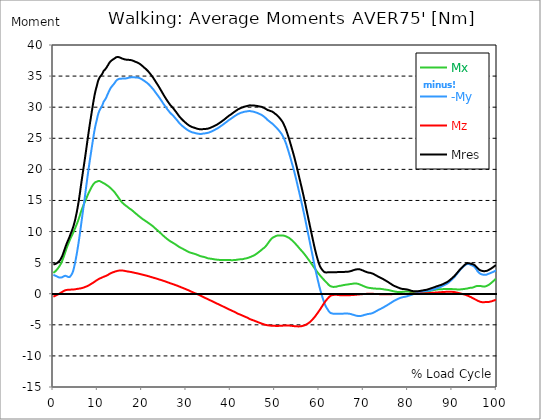
| Category |  Mx |  -My |  Mz |  Mres |
|---|---|---|---|---|
| 0.0 | 3.353 | 3.054 | -0.48 | 4.722 |
| 0.1646090534979424 | 3.444 | 2.991 | -0.417 | 4.74 |
| 0.3292181069958848 | 3.535 | 2.927 | -0.353 | 4.758 |
| 0.5041152263374485 | 3.643 | 2.891 | -0.299 | 4.803 |
| 0.668724279835391 | 3.77 | 2.837 | -0.245 | 4.867 |
| 0.8333333333333333 | 3.906 | 2.764 | -0.181 | 4.93 |
| 0.9979423868312757 | 4.051 | 2.701 | -0.118 | 5.012 |
| 1.162551440329218 | 4.223 | 2.637 | -0.054 | 5.112 |
| 1.337448559670782 | 4.396 | 2.601 | 0.009 | 5.238 |
| 1.5020576131687242 | 4.568 | 2.583 | 0.073 | 5.374 |
| 1.6666666666666665 | 4.785 | 2.592 | 0.154 | 5.574 |
| 1.831275720164609 | 5.03 | 2.637 | 0.227 | 5.809 |
| 1.9958847736625513 | 5.293 | 2.655 | 0.29 | 6.063 |
| 2.170781893004115 | 5.61 | 2.728 | 0.372 | 6.38 |
| 2.3353909465020575 | 5.936 | 2.8 | 0.435 | 6.716 |
| 2.4999999999999996 | 6.281 | 2.864 | 0.498 | 7.06 |
| 2.6646090534979425 | 6.634 | 2.891 | 0.553 | 7.405 |
| 2.829218106995885 | 6.988 | 2.882 | 0.589 | 7.74 |
| 3.0041152263374484 | 7.341 | 2.819 | 0.607 | 8.057 |
| 3.168724279835391 | 7.667 | 2.746 | 0.616 | 8.338 |
| 3.333333333333333 | 7.966 | 2.692 | 0.634 | 8.61 |
| 3.497942386831276 | 8.266 | 2.655 | 0.643 | 8.891 |
| 3.662551440329218 | 8.565 | 2.683 | 0.653 | 9.181 |
| 3.837448559670782 | 8.846 | 2.8 | 0.662 | 9.498 |
| 4.002057613168724 | 9.108 | 2.964 | 0.662 | 9.815 |
| 4.166666666666667 | 9.362 | 3.163 | 0.671 | 10.123 |
| 4.3312757201646095 | 9.607 | 3.408 | 0.671 | 10.441 |
| 4.495884773662552 | 9.852 | 3.734 | 0.671 | 10.785 |
| 4.670781893004115 | 10.132 | 4.242 | 0.689 | 11.22 |
| 4.835390946502058 | 10.404 | 4.749 | 0.707 | 11.646 |
| 4.999999999999999 | 10.694 | 5.347 | 0.725 | 12.163 |
| 5.164609053497943 | 10.993 | 5.973 | 0.743 | 12.725 |
| 5.329218106995885 | 11.284 | 6.625 | 0.77 | 13.314 |
| 5.504115226337448 | 11.601 | 7.359 | 0.788 | 13.975 |
| 5.668724279835391 | 11.918 | 8.111 | 0.807 | 14.673 |
| 5.833333333333333 | 12.28 | 8.909 | 0.825 | 15.434 |
| 5.997942386831276 | 12.643 | 9.725 | 0.843 | 16.232 |
| 6.162551440329218 | 13.033 | 10.631 | 0.861 | 17.12 |
| 6.337448559670782 | 13.377 | 11.51 | 0.888 | 17.945 |
| 6.502057613168724 | 13.703 | 12.38 | 0.915 | 18.761 |
| 6.666666666666666 | 14.011 | 13.25 | 0.952 | 19.576 |
| 6.831275720164609 | 14.311 | 14.12 | 0.997 | 20.365 |
| 6.995884773662552 | 14.592 | 14.981 | 1.033 | 21.162 |
| 7.170781893004115 | 14.872 | 15.906 | 1.088 | 21.978 |
| 7.3353909465020575 | 15.144 | 16.83 | 1.133 | 22.803 |
| 7.500000000000001 | 15.434 | 17.727 | 1.187 | 23.664 |
| 7.664609053497942 | 15.724 | 18.625 | 1.233 | 24.525 |
| 7.829218106995885 | 16.005 | 19.486 | 1.287 | 25.367 |
| 8.004115226337449 | 16.259 | 20.347 | 1.35 | 26.192 |
| 8.168724279835391 | 16.513 | 21.18 | 1.414 | 26.999 |
| 8.333333333333334 | 16.749 | 21.96 | 1.495 | 27.76 |
| 8.497942386831278 | 16.984 | 22.739 | 1.568 | 28.512 |
| 8.662551440329219 | 17.202 | 23.519 | 1.64 | 29.274 |
| 8.837448559670783 | 17.401 | 24.289 | 1.713 | 30.008 |
| 9.002057613168725 | 17.573 | 25.068 | 1.785 | 30.742 |
| 9.166666666666668 | 17.736 | 25.812 | 1.867 | 31.44 |
| 9.33127572016461 | 17.854 | 26.473 | 1.949 | 32.065 |
| 9.495884773662551 | 17.954 | 27.071 | 2.039 | 32.618 |
| 9.670781893004117 | 17.999 | 27.579 | 2.112 | 33.071 |
| 9.83539094650206 | 18.035 | 28.05 | 2.193 | 33.497 |
| 9.999999999999998 | 18.108 | 28.621 | 2.266 | 34.014 |
| 10.16460905349794 | 18.135 | 29.02 | 2.338 | 34.376 |
| 10.329218106995887 | 18.135 | 29.337 | 2.402 | 34.648 |
| 10.504115226337447 | 18.108 | 29.618 | 2.456 | 34.875 |
| 10.66872427983539 | 18.045 | 29.817 | 2.51 | 35.029 |
| 10.833333333333334 | 17.972 | 30.008 | 2.556 | 35.165 |
| 10.997942386831275 | 17.9 | 30.234 | 2.61 | 35.328 |
| 11.162551440329217 | 17.845 | 30.524 | 2.665 | 35.554 |
| 11.337448559670783 | 17.809 | 30.869 | 2.728 | 35.835 |
| 11.502057613168724 | 17.718 | 31.05 | 2.773 | 35.962 |
| 11.666666666666666 | 17.628 | 31.213 | 2.81 | 36.053 |
| 11.831275720164609 | 17.564 | 31.413 | 2.855 | 36.198 |
| 11.995884773662551 | 17.492 | 31.666 | 2.909 | 36.379 |
| 12.170781893004115 | 17.41 | 31.956 | 2.982 | 36.597 |
| 12.335390946502057 | 17.319 | 32.201 | 3.036 | 36.769 |
| 12.5 | 17.238 | 32.5 | 3.118 | 36.995 |
| 12.664609053497943 | 17.129 | 32.745 | 3.19 | 37.159 |
| 12.829218106995885 | 17.029 | 32.971 | 3.263 | 37.322 |
| 13.004115226337449 | 16.903 | 33.162 | 3.317 | 37.439 |
| 13.168724279835391 | 16.803 | 33.316 | 3.371 | 37.53 |
| 13.333333333333332 | 16.694 | 33.461 | 3.417 | 37.612 |
| 13.497942386831276 | 16.576 | 33.597 | 3.453 | 37.693 |
| 13.662551440329217 | 16.449 | 33.742 | 3.498 | 37.766 |
| 13.837448559670783 | 16.304 | 33.905 | 3.535 | 37.856 |
| 14.002057613168724 | 16.141 | 34.086 | 3.58 | 37.947 |
| 14.166666666666666 | 15.987 | 34.249 | 3.616 | 38.029 |
| 14.33127572016461 | 15.815 | 34.358 | 3.652 | 38.065 |
| 14.495884773662551 | 15.652 | 34.449 | 3.689 | 38.074 |
| 14.670781893004115 | 15.48 | 34.521 | 3.707 | 38.074 |
| 14.835390946502057 | 15.317 | 34.548 | 3.725 | 38.038 |
| 15.000000000000002 | 15.144 | 34.566 | 3.743 | 37.983 |
| 15.164609053497943 | 14.963 | 34.585 | 3.752 | 37.938 |
| 15.329218106995883 | 14.818 | 34.585 | 3.752 | 37.874 |
| 15.504115226337449 | 14.682 | 34.594 | 3.743 | 37.829 |
| 15.66872427983539 | 14.564 | 34.594 | 3.725 | 37.784 |
| 15.833333333333334 | 14.465 | 34.603 | 3.707 | 37.748 |
| 15.997942386831276 | 14.356 | 34.612 | 3.689 | 37.72 |
| 16.162551440329217 | 14.256 | 34.612 | 3.661 | 37.675 |
| 16.337448559670783 | 14.175 | 34.621 | 3.634 | 37.657 |
| 16.502057613168724 | 14.084 | 34.639 | 3.616 | 37.639 |
| 16.666666666666668 | 13.993 | 34.666 | 3.589 | 37.63 |
| 16.83127572016461 | 13.903 | 34.702 | 3.571 | 37.621 |
| 16.995884773662556 | 13.803 | 34.739 | 3.553 | 37.612 |
| 17.170781893004115 | 13.703 | 34.766 | 3.535 | 37.603 |
| 17.33539094650206 | 13.631 | 34.784 | 3.516 | 37.584 |
| 17.500000000000004 | 13.558 | 34.802 | 3.489 | 37.566 |
| 17.66460905349794 | 13.468 | 34.82 | 3.471 | 37.548 |
| 17.82921810699589 | 13.368 | 34.829 | 3.444 | 37.512 |
| 18.00411522633745 | 13.268 | 34.82 | 3.417 | 37.467 |
| 18.16872427983539 | 13.16 | 34.811 | 3.39 | 37.412 |
| 18.333333333333336 | 13.06 | 34.793 | 3.362 | 37.358 |
| 18.497942386831276 | 12.951 | 34.784 | 3.335 | 37.304 |
| 18.66255144032922 | 12.851 | 34.784 | 3.317 | 37.258 |
| 18.837448559670786 | 12.761 | 34.775 | 3.29 | 37.222 |
| 19.002057613168724 | 12.661 | 34.766 | 3.263 | 37.177 |
| 19.166666666666668 | 12.552 | 34.739 | 3.236 | 37.104 |
| 19.331275720164612 | 12.462 | 34.702 | 3.208 | 37.032 |
| 19.495884773662553 | 12.371 | 34.657 | 3.181 | 36.959 |
| 19.67078189300412 | 12.271 | 34.603 | 3.145 | 36.869 |
| 19.83539094650206 | 12.172 | 34.539 | 3.118 | 36.778 |
| 19.999999999999996 | 12.081 | 34.467 | 3.091 | 36.678 |
| 20.164609053497944 | 11.999 | 34.394 | 3.054 | 36.578 |
| 20.32921810699588 | 11.909 | 34.322 | 3.027 | 36.479 |
| 20.504115226337447 | 11.836 | 34.231 | 2.991 | 36.361 |
| 20.66872427983539 | 11.755 | 34.15 | 2.964 | 36.261 |
| 20.833333333333332 | 11.682 | 34.068 | 2.936 | 36.162 |
| 20.997942386831276 | 11.601 | 33.996 | 2.909 | 36.062 |
| 21.162551440329217 | 11.519 | 33.896 | 2.873 | 35.935 |
| 21.33744855967078 | 11.438 | 33.796 | 2.837 | 35.808 |
| 21.502057613168724 | 11.347 | 33.687 | 2.81 | 35.681 |
| 21.666666666666668 | 11.265 | 33.57 | 2.773 | 35.536 |
| 21.83127572016461 | 11.184 | 33.434 | 2.737 | 35.382 |
| 21.99588477366255 | 11.102 | 33.298 | 2.701 | 35.228 |
| 22.170781893004115 | 11.012 | 33.171 | 2.665 | 35.074 |
| 22.335390946502056 | 10.921 | 33.035 | 2.628 | 34.911 |
| 22.5 | 10.821 | 32.899 | 2.592 | 34.748 |
| 22.664609053497944 | 10.713 | 32.745 | 2.556 | 34.566 |
| 22.82921810699588 | 10.604 | 32.591 | 2.529 | 34.385 |
| 23.004115226337447 | 10.495 | 32.419 | 2.492 | 34.195 |
| 23.16872427983539 | 10.386 | 32.264 | 2.456 | 34.005 |
| 23.333333333333332 | 10.278 | 32.101 | 2.42 | 33.814 |
| 23.497942386831276 | 10.187 | 31.947 | 2.375 | 33.642 |
| 23.662551440329217 | 10.078 | 31.784 | 2.338 | 33.443 |
| 23.83744855967078 | 9.969 | 31.612 | 2.302 | 33.252 |
| 24.002057613168727 | 9.861 | 31.44 | 2.266 | 33.044 |
| 24.166666666666664 | 9.752 | 31.258 | 2.23 | 32.845 |
| 24.33127572016461 | 9.634 | 31.086 | 2.193 | 32.636 |
| 24.495884773662553 | 9.525 | 30.905 | 2.157 | 32.437 |
| 24.670781893004115 | 9.417 | 30.724 | 2.112 | 32.228 |
| 24.83539094650206 | 9.308 | 30.542 | 2.075 | 32.02 |
| 25.0 | 9.199 | 30.37 | 2.039 | 31.82 |
| 25.164609053497944 | 9.099 | 30.207 | 1.994 | 31.63 |
| 25.329218106995885 | 9 | 30.035 | 1.958 | 31.44 |
| 25.504115226337447 | 8.9 | 29.872 | 1.912 | 31.249 |
| 25.66872427983539 | 8.8 | 29.709 | 1.867 | 31.068 |
| 25.833333333333332 | 8.71 | 29.555 | 1.822 | 30.896 |
| 25.997942386831276 | 8.619 | 29.41 | 1.785 | 30.724 |
| 26.16255144032922 | 8.537 | 29.256 | 1.74 | 30.552 |
| 26.337448559670783 | 8.456 | 29.111 | 1.695 | 30.388 |
| 26.502057613168724 | 8.383 | 28.993 | 1.659 | 30.252 |
| 26.666666666666664 | 8.311 | 28.875 | 1.613 | 30.117 |
| 26.83127572016461 | 8.247 | 28.757 | 1.577 | 29.99 |
| 26.995884773662553 | 8.175 | 28.648 | 1.532 | 29.863 |
| 27.170781893004115 | 8.102 | 28.512 | 1.486 | 29.709 |
| 27.33539094650206 | 8.03 | 28.376 | 1.45 | 29.555 |
| 27.499999999999996 | 7.957 | 28.25 | 1.405 | 29.41 |
| 27.66460905349794 | 7.876 | 28.105 | 1.359 | 29.246 |
| 27.829218106995885 | 7.794 | 27.96 | 1.323 | 29.083 |
| 28.004115226337447 | 7.713 | 27.815 | 1.278 | 28.92 |
| 28.16872427983539 | 7.631 | 27.66 | 1.224 | 28.748 |
| 28.333333333333332 | 7.55 | 27.515 | 1.178 | 28.585 |
| 28.49794238683128 | 7.477 | 27.389 | 1.133 | 28.44 |
| 28.66255144032922 | 7.414 | 27.262 | 1.088 | 28.304 |
| 28.837448559670783 | 7.35 | 27.144 | 1.033 | 28.177 |
| 29.002057613168724 | 7.287 | 27.035 | 0.988 | 28.05 |
| 29.166666666666664 | 7.232 | 26.926 | 0.943 | 27.932 |
| 29.331275720164612 | 7.169 | 26.836 | 0.888 | 27.815 |
| 29.495884773662553 | 7.105 | 26.736 | 0.843 | 27.706 |
| 29.670781893004115 | 7.042 | 26.645 | 0.798 | 27.597 |
| 29.835390946502056 | 6.979 | 26.555 | 0.752 | 27.497 |
| 30.000000000000004 | 6.915 | 26.464 | 0.698 | 27.398 |
| 30.164609053497944 | 6.843 | 26.383 | 0.653 | 27.298 |
| 30.329218106995885 | 6.779 | 26.301 | 0.598 | 27.198 |
| 30.504115226337447 | 6.716 | 26.228 | 0.553 | 27.108 |
| 30.66872427983539 | 6.67 | 26.165 | 0.498 | 27.035 |
| 30.833333333333336 | 6.625 | 26.102 | 0.435 | 26.972 |
| 30.99794238683128 | 6.589 | 26.047 | 0.381 | 26.908 |
| 31.162551440329217 | 6.553 | 26.002 | 0.326 | 26.854 |
| 31.33744855967078 | 6.516 | 25.957 | 0.272 | 26.799 |
| 31.50205761316873 | 6.489 | 25.929 | 0.218 | 26.763 |
| 31.666666666666668 | 6.453 | 25.902 | 0.163 | 26.727 |
| 31.831275720164612 | 6.417 | 25.875 | 0.118 | 26.691 |
| 31.995884773662553 | 6.38 | 25.839 | 0.063 | 26.645 |
| 32.17078189300411 | 6.335 | 25.812 | 0.018 | 26.609 |
| 32.33539094650206 | 6.29 | 25.775 | -0.018 | 26.564 |
| 32.5 | 6.244 | 25.748 | -0.073 | 26.528 |
| 32.66460905349794 | 6.19 | 25.73 | -0.127 | 26.5 |
| 32.82921810699589 | 6.145 | 25.712 | -0.181 | 26.473 |
| 33.00411522633745 | 6.09 | 25.703 | -0.236 | 26.455 |
| 33.168724279835395 | 6.045 | 25.694 | -0.299 | 26.428 |
| 33.333333333333336 | 6.018 | 25.685 | -0.363 | 26.428 |
| 33.49794238683128 | 5.982 | 25.703 | -0.417 | 26.437 |
| 33.66255144032922 | 5.963 | 25.739 | -0.48 | 26.464 |
| 33.83744855967078 | 5.936 | 25.766 | -0.535 | 26.482 |
| 34.00205761316873 | 5.9 | 25.775 | -0.589 | 26.491 |
| 34.16666666666667 | 5.873 | 25.784 | -0.653 | 26.491 |
| 34.331275720164605 | 5.828 | 25.793 | -0.707 | 26.5 |
| 34.49588477366255 | 5.791 | 25.812 | -0.761 | 26.5 |
| 34.67078189300412 | 5.737 | 25.848 | -0.816 | 26.528 |
| 34.83539094650206 | 5.701 | 25.875 | -0.861 | 26.555 |
| 35.00000000000001 | 5.673 | 25.902 | -0.924 | 26.573 |
| 35.16460905349794 | 5.655 | 25.948 | -0.979 | 26.618 |
| 35.32921810699588 | 5.646 | 25.993 | -1.042 | 26.664 |
| 35.504115226337454 | 5.637 | 26.047 | -1.097 | 26.709 |
| 35.668724279835395 | 5.61 | 26.093 | -1.151 | 26.763 |
| 35.833333333333336 | 5.592 | 26.147 | -1.205 | 26.809 |
| 35.99794238683128 | 5.574 | 26.21 | -1.269 | 26.872 |
| 36.16255144032922 | 5.556 | 26.274 | -1.332 | 26.926 |
| 36.33744855967078 | 5.538 | 26.328 | -1.387 | 26.981 |
| 36.50205761316873 | 5.51 | 26.392 | -1.441 | 27.044 |
| 36.66666666666667 | 5.492 | 26.455 | -1.495 | 27.108 |
| 36.831275720164605 | 5.483 | 26.518 | -1.55 | 27.171 |
| 36.99588477366255 | 5.465 | 26.582 | -1.613 | 27.234 |
| 37.17078189300412 | 5.456 | 26.664 | -1.668 | 27.307 |
| 37.33539094650206 | 5.447 | 26.736 | -1.722 | 27.389 |
| 37.5 | 5.438 | 26.818 | -1.785 | 27.47 |
| 37.66460905349794 | 5.42 | 26.899 | -1.84 | 27.552 |
| 37.82921810699589 | 5.411 | 26.99 | -1.894 | 27.642 |
| 38.00411522633745 | 5.402 | 27.071 | -1.949 | 27.724 |
| 38.168724279835395 | 5.411 | 27.153 | -2.012 | 27.805 |
| 38.333333333333336 | 5.411 | 27.234 | -2.066 | 27.896 |
| 38.49794238683127 | 5.411 | 27.325 | -2.121 | 27.987 |
| 38.662551440329224 | 5.411 | 27.416 | -2.175 | 28.077 |
| 38.83744855967078 | 5.411 | 27.506 | -2.239 | 28.177 |
| 39.00205761316872 | 5.411 | 27.597 | -2.293 | 28.277 |
| 39.16666666666667 | 5.42 | 27.688 | -2.347 | 28.367 |
| 39.331275720164605 | 5.42 | 27.778 | -2.411 | 28.467 |
| 39.49588477366255 | 5.42 | 27.869 | -2.474 | 28.558 |
| 39.67078189300412 | 5.42 | 27.96 | -2.529 | 28.657 |
| 39.83539094650206 | 5.42 | 28.041 | -2.592 | 28.739 |
| 39.99999999999999 | 5.402 | 28.114 | -2.637 | 28.811 |
| 40.16460905349794 | 5.393 | 28.195 | -2.692 | 28.884 |
| 40.32921810699589 | 5.393 | 28.277 | -2.746 | 28.975 |
| 40.50411522633745 | 5.402 | 28.367 | -2.8 | 29.065 |
| 40.668724279835395 | 5.402 | 28.458 | -2.855 | 29.165 |
| 40.83333333333333 | 5.411 | 28.54 | -2.918 | 29.256 |
| 40.99794238683128 | 5.429 | 28.612 | -2.973 | 29.328 |
| 41.16255144032922 | 5.438 | 28.685 | -3.036 | 29.41 |
| 41.33744855967078 | 5.456 | 28.757 | -3.1 | 29.491 |
| 41.50205761316872 | 5.474 | 28.839 | -3.163 | 29.582 |
| 41.666666666666664 | 5.492 | 28.902 | -3.217 | 29.663 |
| 41.83127572016461 | 5.519 | 28.956 | -3.263 | 29.718 |
| 41.99588477366255 | 5.538 | 29.002 | -3.317 | 29.772 |
| 42.17078189300412 | 5.528 | 29.056 | -3.362 | 29.836 |
| 42.33539094650206 | 5.528 | 29.111 | -3.408 | 29.881 |
| 42.5 | 5.538 | 29.138 | -3.462 | 29.926 |
| 42.66460905349794 | 5.547 | 29.174 | -3.516 | 29.962 |
| 42.82921810699589 | 5.574 | 29.228 | -3.562 | 30.017 |
| 43.00411522633745 | 5.61 | 29.246 | -3.616 | 30.062 |
| 43.16872427983539 | 5.646 | 29.274 | -3.671 | 30.089 |
| 43.333333333333336 | 5.664 | 29.292 | -3.725 | 30.126 |
| 43.49794238683128 | 5.683 | 29.31 | -3.77 | 30.153 |
| 43.66255144032922 | 5.71 | 29.328 | -3.825 | 30.18 |
| 43.83744855967078 | 5.746 | 29.346 | -3.879 | 30.207 |
| 44.00205761316873 | 5.791 | 29.364 | -3.942 | 30.243 |
| 44.166666666666664 | 5.837 | 29.382 | -4.015 | 30.28 |
| 44.33127572016461 | 5.882 | 29.382 | -4.078 | 30.298 |
| 44.49588477366255 | 5.927 | 29.355 | -4.124 | 30.289 |
| 44.67078189300411 | 5.973 | 29.328 | -4.169 | 30.28 |
| 44.835390946502066 | 6.027 | 29.319 | -4.205 | 30.28 |
| 45.0 | 6.072 | 29.292 | -4.251 | 30.271 |
| 45.16460905349794 | 6.127 | 29.265 | -4.296 | 30.271 |
| 45.32921810699589 | 6.19 | 29.237 | -4.341 | 30.262 |
| 45.504115226337454 | 6.263 | 29.201 | -4.387 | 30.243 |
| 45.668724279835395 | 6.344 | 29.156 | -4.432 | 30.225 |
| 45.83333333333333 | 6.426 | 29.12 | -4.486 | 30.207 |
| 45.99794238683128 | 6.507 | 29.074 | -4.532 | 30.189 |
| 46.16255144032922 | 6.598 | 29.02 | -4.577 | 30.171 |
| 46.33744855967078 | 6.689 | 28.975 | -4.622 | 30.144 |
| 46.50205761316873 | 6.788 | 28.911 | -4.667 | 30.117 |
| 46.666666666666664 | 6.888 | 28.857 | -4.713 | 30.098 |
| 46.831275720164605 | 6.969 | 28.811 | -4.758 | 30.071 |
| 46.99588477366255 | 7.069 | 28.748 | -4.803 | 30.044 |
| 47.17078189300412 | 7.187 | 28.666 | -4.84 | 29.999 |
| 47.33539094650206 | 7.269 | 28.585 | -4.885 | 29.944 |
| 47.5 | 7.35 | 28.503 | -4.921 | 29.89 |
| 47.66460905349794 | 7.459 | 28.404 | -4.967 | 29.827 |
| 47.82921810699588 | 7.577 | 28.295 | -5.003 | 29.763 |
| 48.004115226337454 | 7.713 | 28.186 | -5.03 | 29.691 |
| 48.168724279835395 | 7.867 | 28.059 | -5.048 | 29.609 |
| 48.33333333333333 | 8.03 | 27.941 | -5.066 | 29.546 |
| 48.49794238683128 | 8.193 | 27.851 | -5.084 | 29.509 |
| 48.66255144032922 | 8.365 | 27.76 | -5.102 | 29.473 |
| 48.83744855967078 | 8.528 | 27.66 | -5.121 | 29.428 |
| 49.00205761316873 | 8.673 | 27.561 | -5.13 | 29.382 |
| 49.166666666666664 | 8.818 | 27.47 | -5.139 | 29.337 |
| 49.331275720164605 | 8.936 | 27.389 | -5.148 | 29.301 |
| 49.49588477366255 | 9.027 | 27.289 | -5.157 | 29.237 |
| 49.67078189300412 | 9.09 | 27.18 | -5.166 | 29.156 |
| 49.83539094650206 | 9.136 | 27.062 | -5.166 | 29.056 |
| 50.0 | 9.199 | 26.926 | -5.166 | 28.956 |
| 50.16460905349794 | 9.272 | 26.809 | -5.175 | 28.875 |
| 50.32921810699589 | 9.326 | 26.691 | -5.184 | 28.784 |
| 50.504115226337454 | 9.353 | 26.564 | -5.184 | 28.666 |
| 50.668724279835395 | 9.362 | 26.437 | -5.175 | 28.549 |
| 50.83333333333333 | 9.371 | 26.301 | -5.175 | 28.431 |
| 50.99794238683128 | 9.371 | 26.156 | -5.166 | 28.295 |
| 51.162551440329224 | 9.38 | 25.993 | -5.166 | 28.15 |
| 51.33744855967078 | 9.38 | 25.839 | -5.157 | 28.005 |
| 51.50205761316873 | 9.371 | 25.676 | -5.148 | 27.851 |
| 51.666666666666664 | 9.371 | 25.476 | -5.139 | 27.67 |
| 51.83127572016461 | 9.362 | 25.25 | -5.13 | 27.452 |
| 51.99588477366255 | 9.335 | 24.996 | -5.121 | 27.207 |
| 52.17078189300412 | 9.308 | 24.724 | -5.121 | 26.944 |
| 52.335390946502066 | 9.262 | 24.434 | -5.112 | 26.673 |
| 52.5 | 9.217 | 24.117 | -5.112 | 26.355 |
| 52.66460905349795 | 9.163 | 23.754 | -5.112 | 26.011 |
| 52.82921810699588 | 9.099 | 23.383 | -5.121 | 25.658 |
| 53.00411522633745 | 9.045 | 23.002 | -5.121 | 25.286 |
| 53.1687242798354 | 8.972 | 22.612 | -5.13 | 24.914 |
| 53.33333333333333 | 8.891 | 22.214 | -5.13 | 24.525 |
| 53.49794238683128 | 8.8 | 21.797 | -5.148 | 24.117 |
| 53.66255144032922 | 8.701 | 21.38 | -5.157 | 23.709 |
| 53.83744855967078 | 8.592 | 20.954 | -5.175 | 23.292 |
| 54.00205761316873 | 8.492 | 20.546 | -5.184 | 22.884 |
| 54.166666666666664 | 8.374 | 20.111 | -5.202 | 22.458 |
| 54.33127572016461 | 8.256 | 19.667 | -5.211 | 22.023 |
| 54.495884773662546 | 8.12 | 19.196 | -5.22 | 21.561 |
| 54.67078189300412 | 7.994 | 18.715 | -5.238 | 21.081 |
| 54.835390946502066 | 7.858 | 18.226 | -5.248 | 20.609 |
| 54.99999999999999 | 7.722 | 17.727 | -5.248 | 20.111 |
| 55.16460905349795 | 7.586 | 17.211 | -5.257 | 19.612 |
| 55.32921810699588 | 7.441 | 16.703 | -5.257 | 19.105 |
| 55.50411522633745 | 7.305 | 16.187 | -5.248 | 18.606 |
| 55.668724279835395 | 7.169 | 15.67 | -5.238 | 18.108 |
| 55.83333333333333 | 7.033 | 15.153 | -5.22 | 17.6 |
| 55.99794238683128 | 6.915 | 14.646 | -5.211 | 17.111 |
| 56.162551440329224 | 6.779 | 14.111 | -5.184 | 16.604 |
| 56.33744855967078 | 6.634 | 13.567 | -5.157 | 16.078 |
| 56.50205761316873 | 6.489 | 13.024 | -5.121 | 15.543 |
| 56.666666666666664 | 6.344 | 12.471 | -5.084 | 15.008 |
| 56.83127572016461 | 6.19 | 11.9 | -5.03 | 14.456 |
| 56.99588477366256 | 6.036 | 11.311 | -4.967 | 13.885 |
| 57.17078189300412 | 5.873 | 10.722 | -4.903 | 13.314 |
| 57.335390946502066 | 5.71 | 10.142 | -4.831 | 12.752 |
| 57.49999999999999 | 5.547 | 9.552 | -4.758 | 12.181 |
| 57.66460905349794 | 5.383 | 8.963 | -4.677 | 11.61 |
| 57.829218106995896 | 5.22 | 8.383 | -4.586 | 11.048 |
| 58.00411522633745 | 5.057 | 7.794 | -4.477 | 10.495 |
| 58.168724279835395 | 4.885 | 7.214 | -4.359 | 9.942 |
| 58.33333333333333 | 4.713 | 6.625 | -4.242 | 9.38 |
| 58.49794238683128 | 4.55 | 6.036 | -4.106 | 8.827 |
| 58.662551440329224 | 4.377 | 5.456 | -3.979 | 8.275 |
| 58.83744855967078 | 4.205 | 4.876 | -3.843 | 7.731 |
| 59.00205761316873 | 4.042 | 4.296 | -3.698 | 7.214 |
| 59.16666666666666 | 3.87 | 3.734 | -3.535 | 6.716 |
| 59.33127572016461 | 3.698 | 3.199 | -3.381 | 6.254 |
| 59.49588477366256 | 3.535 | 2.683 | -3.208 | 5.828 |
| 59.67078189300411 | 3.381 | 2.175 | -3.045 | 5.42 |
| 59.835390946502066 | 3.226 | 1.677 | -2.873 | 5.039 |
| 60.00000000000001 | 3.081 | 1.187 | -2.701 | 4.686 |
| 60.16460905349794 | 2.936 | 0.734 | -2.529 | 4.377 |
| 60.32921810699589 | 2.8 | 0.317 | -2.347 | 4.169 |
| 60.50411522633745 | 2.665 | -0.091 | -2.157 | 3.988 |
| 60.66872427983539 | 2.529 | -0.48 | -1.976 | 3.834 |
| 60.833333333333336 | 2.393 | -0.861 | -1.785 | 3.689 |
| 60.99794238683128 | 2.266 | -1.224 | -1.604 | 3.562 |
| 61.162551440329224 | 2.139 | -1.559 | -1.432 | 3.471 |
| 61.33744855967078 | 2.012 | -1.849 | -1.26 | 3.426 |
| 61.50205761316872 | 1.885 | -2.085 | -1.097 | 3.417 |
| 61.66666666666667 | 1.767 | -2.293 | -0.952 | 3.426 |
| 61.831275720164605 | 1.64 | -2.474 | -0.816 | 3.435 |
| 61.99588477366256 | 1.523 | -2.665 | -0.68 | 3.435 |
| 62.17078189300411 | 1.396 | -2.846 | -0.553 | 3.435 |
| 62.33539094650205 | 1.296 | -2.982 | -0.435 | 3.435 |
| 62.50000000000001 | 1.214 | -3.091 | -0.335 | 3.453 |
| 62.66460905349794 | 1.178 | -3.118 | -0.281 | 3.444 |
| 62.82921810699589 | 1.142 | -3.163 | -0.245 | 3.453 |
| 63.00411522633746 | 1.115 | -3.199 | -0.208 | 3.462 |
| 63.16872427983539 | 1.097 | -3.217 | -0.19 | 3.462 |
| 63.333333333333336 | 1.097 | -3.236 | -0.181 | 3.462 |
| 63.49794238683128 | 1.106 | -3.226 | -0.181 | 3.453 |
| 63.662551440329224 | 1.115 | -3.226 | -0.172 | 3.453 |
| 63.83744855967079 | 1.133 | -3.226 | -0.172 | 3.462 |
| 64.00205761316873 | 1.169 | -3.226 | -0.19 | 3.471 |
| 64.16666666666667 | 1.205 | -3.226 | -0.199 | 3.48 |
| 64.3312757201646 | 1.242 | -3.226 | -0.218 | 3.489 |
| 64.49588477366255 | 1.26 | -3.217 | -0.227 | 3.489 |
| 64.67078189300412 | 1.278 | -3.208 | -0.227 | 3.489 |
| 64.83539094650206 | 1.287 | -3.208 | -0.236 | 3.489 |
| 65.0 | 1.314 | -3.208 | -0.245 | 3.489 |
| 65.16460905349794 | 1.341 | -3.208 | -0.254 | 3.498 |
| 65.32921810699588 | 1.369 | -3.199 | -0.263 | 3.507 |
| 65.50411522633745 | 1.396 | -3.199 | -0.263 | 3.507 |
| 65.66872427983539 | 1.414 | -3.199 | -0.263 | 3.516 |
| 65.83333333333334 | 1.432 | -3.19 | -0.263 | 3.516 |
| 65.99794238683127 | 1.459 | -3.19 | -0.263 | 3.526 |
| 66.16255144032922 | 1.468 | -3.19 | -0.263 | 3.535 |
| 66.33744855967079 | 1.486 | -3.199 | -0.263 | 3.544 |
| 66.50205761316873 | 1.495 | -3.199 | -0.254 | 3.544 |
| 66.66666666666667 | 1.514 | -3.208 | -0.245 | 3.562 |
| 66.8312757201646 | 1.541 | -3.226 | -0.245 | 3.589 |
| 66.99588477366255 | 1.55 | -3.254 | -0.227 | 3.616 |
| 67.17078189300412 | 1.568 | -3.281 | -0.218 | 3.652 |
| 67.33539094650206 | 1.586 | -3.317 | -0.208 | 3.689 |
| 67.5 | 1.604 | -3.353 | -0.199 | 3.734 |
| 67.66460905349794 | 1.622 | -3.39 | -0.199 | 3.77 |
| 67.8292181069959 | 1.64 | -3.426 | -0.19 | 3.816 |
| 68.00411522633746 | 1.649 | -3.462 | -0.181 | 3.852 |
| 68.16872427983539 | 1.649 | -3.507 | -0.172 | 3.888 |
| 68.33333333333334 | 1.64 | -3.526 | -0.163 | 3.906 |
| 68.49794238683127 | 1.622 | -3.553 | -0.145 | 3.924 |
| 68.66255144032921 | 1.595 | -3.589 | -0.136 | 3.942 |
| 68.83744855967078 | 1.568 | -3.598 | -0.127 | 3.942 |
| 69.00205761316872 | 1.523 | -3.607 | -0.109 | 3.933 |
| 69.16666666666667 | 1.477 | -3.598 | -0.1 | 3.915 |
| 69.33127572016461 | 1.432 | -3.58 | -0.082 | 3.87 |
| 69.49588477366255 | 1.378 | -3.553 | -0.073 | 3.825 |
| 69.67078189300412 | 1.323 | -3.526 | -0.063 | 3.779 |
| 69.83539094650206 | 1.269 | -3.489 | -0.063 | 3.734 |
| 70.00000000000001 | 1.214 | -3.444 | -0.054 | 3.671 |
| 70.16460905349794 | 1.169 | -3.408 | -0.045 | 3.625 |
| 70.32921810699588 | 1.115 | -3.39 | -0.036 | 3.58 |
| 70.50411522633745 | 1.079 | -3.353 | -0.027 | 3.535 |
| 70.66872427983539 | 1.033 | -3.317 | -0.018 | 3.489 |
| 70.83333333333333 | 0.997 | -3.281 | -0.018 | 3.444 |
| 70.99794238683128 | 0.97 | -3.263 | -0.009 | 3.417 |
| 71.16255144032922 | 0.952 | -3.245 | -0.009 | 3.39 |
| 71.33744855967079 | 0.933 | -3.236 | 0 | 3.371 |
| 71.50205761316873 | 0.915 | -3.217 | 0 | 3.353 |
| 71.66666666666667 | 0.906 | -3.181 | -0.009 | 3.317 |
| 71.83127572016461 | 0.888 | -3.154 | -0.009 | 3.29 |
| 71.99588477366255 | 0.87 | -3.118 | -0.018 | 3.245 |
| 72.17078189300412 | 0.852 | -3.063 | -0.018 | 3.19 |
| 72.33539094650205 | 0.843 | -3 | -0.027 | 3.127 |
| 72.5 | 0.834 | -2.936 | -0.036 | 3.063 |
| 72.66460905349795 | 0.825 | -2.882 | -0.036 | 3 |
| 72.82921810699588 | 0.816 | -2.81 | -0.045 | 2.936 |
| 73.00411522633746 | 0.807 | -2.737 | -0.054 | 2.864 |
| 73.1687242798354 | 0.798 | -2.674 | -0.054 | 2.8 |
| 73.33333333333334 | 0.798 | -2.61 | -0.063 | 2.737 |
| 73.49794238683127 | 0.798 | -2.547 | -0.063 | 2.674 |
| 73.66255144032921 | 0.788 | -2.492 | -0.073 | 2.619 |
| 73.83744855967078 | 0.779 | -2.438 | -0.073 | 2.565 |
| 74.00205761316873 | 0.77 | -2.375 | -0.073 | 2.51 |
| 74.16666666666667 | 0.752 | -2.311 | -0.073 | 2.447 |
| 74.33127572016461 | 0.734 | -2.248 | -0.082 | 2.375 |
| 74.49588477366255 | 0.707 | -2.184 | -0.082 | 2.311 |
| 74.67078189300412 | 0.689 | -2.112 | -0.082 | 2.239 |
| 74.83539094650207 | 0.671 | -2.039 | -0.082 | 2.166 |
| 75.0 | 0.653 | -1.967 | -0.082 | 2.094 |
| 75.16460905349794 | 0.643 | -1.903 | -0.082 | 2.03 |
| 75.32921810699588 | 0.625 | -1.831 | -0.082 | 1.958 |
| 75.50411522633745 | 0.607 | -1.758 | -0.082 | 1.885 |
| 75.6687242798354 | 0.58 | -1.677 | -0.082 | 1.804 |
| 75.83333333333333 | 0.553 | -1.604 | -0.082 | 1.722 |
| 75.99794238683128 | 0.526 | -1.532 | -0.073 | 1.649 |
| 76.16255144032922 | 0.498 | -1.459 | -0.073 | 1.577 |
| 76.33744855967079 | 0.471 | -1.378 | -0.073 | 1.495 |
| 76.50205761316873 | 0.435 | -1.296 | -0.063 | 1.414 |
| 76.66666666666667 | 0.408 | -1.224 | -0.063 | 1.341 |
| 76.83127572016461 | 0.381 | -1.16 | -0.063 | 1.278 |
| 76.99588477366254 | 0.363 | -1.097 | -0.054 | 1.224 |
| 77.17078189300412 | 0.335 | -1.033 | -0.054 | 1.178 |
| 77.33539094650206 | 0.317 | -0.97 | -0.054 | 1.124 |
| 77.5 | 0.299 | -0.915 | -0.045 | 1.079 |
| 77.66460905349794 | 0.281 | -0.861 | -0.045 | 1.033 |
| 77.82921810699588 | 0.263 | -0.798 | -0.045 | 0.979 |
| 78.00411522633745 | 0.263 | -0.743 | -0.054 | 0.924 |
| 78.1687242798354 | 0.263 | -0.698 | -0.054 | 0.879 |
| 78.33333333333334 | 0.263 | -0.653 | -0.054 | 0.843 |
| 78.49794238683127 | 0.272 | -0.616 | -0.054 | 0.807 |
| 78.66255144032921 | 0.29 | -0.58 | -0.054 | 0.779 |
| 78.83744855967078 | 0.308 | -0.553 | -0.045 | 0.761 |
| 79.00205761316873 | 0.326 | -0.526 | -0.045 | 0.752 |
| 79.16666666666667 | 0.335 | -0.508 | -0.045 | 0.743 |
| 79.33127572016461 | 0.344 | -0.489 | -0.045 | 0.734 |
| 79.49588477366257 | 0.344 | -0.462 | -0.036 | 0.725 |
| 79.67078189300412 | 0.353 | -0.435 | -0.036 | 0.707 |
| 79.83539094650207 | 0.353 | -0.399 | -0.036 | 0.671 |
| 79.99999999999999 | 0.353 | -0.353 | -0.027 | 0.643 |
| 80.16460905349794 | 0.344 | -0.317 | -0.027 | 0.616 |
| 80.32921810699588 | 0.326 | -0.281 | -0.027 | 0.571 |
| 80.50411522633745 | 0.299 | -0.245 | -0.018 | 0.535 |
| 80.66872427983539 | 0.272 | -0.199 | -0.018 | 0.489 |
| 80.83333333333333 | 0.245 | -0.163 | -0.009 | 0.453 |
| 80.99794238683128 | 0.218 | -0.127 | -0.009 | 0.426 |
| 81.16255144032922 | 0.19 | -0.082 | -0.009 | 0.408 |
| 81.33744855967079 | 0.163 | -0.036 | 0 | 0.399 |
| 81.50205761316873 | 0.136 | 0.009 | 0 | 0.39 |
| 81.66666666666666 | 0.1 | 0.045 | 0 | 0.39 |
| 81.83127572016461 | 0.082 | 0.082 | 0 | 0.381 |
| 81.99588477366255 | 0.054 | 0.118 | 0.009 | 0.399 |
| 82.1707818930041 | 0.045 | 0.145 | 0.009 | 0.408 |
| 82.33539094650206 | 0.045 | 0.163 | 0.009 | 0.417 |
| 82.5 | 0.054 | 0.19 | 0.009 | 0.426 |
| 82.66460905349794 | 0.054 | 0.227 | 0.009 | 0.435 |
| 82.8292181069959 | 0.063 | 0.254 | 0.018 | 0.462 |
| 83.00411522633745 | 0.082 | 0.281 | 0.027 | 0.48 |
| 83.1687242798354 | 0.1 | 0.308 | 0.027 | 0.508 |
| 83.33333333333333 | 0.118 | 0.335 | 0.036 | 0.535 |
| 83.49794238683127 | 0.136 | 0.363 | 0.045 | 0.553 |
| 83.66255144032922 | 0.163 | 0.39 | 0.045 | 0.571 |
| 83.83744855967078 | 0.19 | 0.408 | 0.054 | 0.598 |
| 84.00205761316873 | 0.227 | 0.426 | 0.063 | 0.616 |
| 84.16666666666667 | 0.254 | 0.444 | 0.073 | 0.634 |
| 84.33127572016461 | 0.29 | 0.453 | 0.073 | 0.662 |
| 84.49588477366257 | 0.326 | 0.48 | 0.091 | 0.698 |
| 84.67078189300412 | 0.372 | 0.498 | 0.1 | 0.725 |
| 84.83539094650206 | 0.417 | 0.526 | 0.109 | 0.779 |
| 85.0 | 0.453 | 0.544 | 0.118 | 0.816 |
| 85.16460905349794 | 0.489 | 0.571 | 0.127 | 0.861 |
| 85.32921810699588 | 0.526 | 0.598 | 0.136 | 0.897 |
| 85.50411522633745 | 0.553 | 0.634 | 0.145 | 0.943 |
| 85.66872427983539 | 0.571 | 0.671 | 0.154 | 0.979 |
| 85.83333333333334 | 0.598 | 0.707 | 0.163 | 1.015 |
| 85.99794238683128 | 0.625 | 0.743 | 0.172 | 1.06 |
| 86.16255144032922 | 0.643 | 0.788 | 0.181 | 1.106 |
| 86.33744855967078 | 0.662 | 0.834 | 0.181 | 1.151 |
| 86.50205761316873 | 0.68 | 0.87 | 0.19 | 1.196 |
| 86.66666666666667 | 0.698 | 0.906 | 0.208 | 1.233 |
| 86.8312757201646 | 0.716 | 0.943 | 0.218 | 1.269 |
| 86.99588477366255 | 0.716 | 0.988 | 0.227 | 1.314 |
| 87.17078189300412 | 0.707 | 1.033 | 0.236 | 1.35 |
| 87.33539094650206 | 0.716 | 1.088 | 0.245 | 1.387 |
| 87.5 | 0.725 | 1.142 | 0.254 | 1.423 |
| 87.66460905349794 | 0.725 | 1.196 | 0.263 | 1.468 |
| 87.8292181069959 | 0.734 | 1.251 | 0.272 | 1.523 |
| 88.00411522633746 | 0.752 | 1.305 | 0.281 | 1.577 |
| 88.1687242798354 | 0.761 | 1.369 | 0.29 | 1.64 |
| 88.33333333333333 | 0.761 | 1.432 | 0.299 | 1.695 |
| 88.49794238683127 | 0.77 | 1.486 | 0.299 | 1.749 |
| 88.66255144032922 | 0.77 | 1.559 | 0.308 | 1.813 |
| 88.83744855967079 | 0.779 | 1.622 | 0.317 | 1.876 |
| 89.00205761316872 | 0.779 | 1.713 | 0.317 | 1.958 |
| 89.16666666666667 | 0.77 | 1.794 | 0.317 | 2.03 |
| 89.33127572016461 | 0.77 | 1.894 | 0.317 | 2.13 |
| 89.49588477366255 | 0.761 | 2.012 | 0.308 | 2.23 |
| 89.67078189300413 | 0.761 | 2.112 | 0.308 | 2.329 |
| 89.83539094650206 | 0.752 | 2.23 | 0.308 | 2.429 |
| 90.0 | 0.743 | 2.347 | 0.299 | 2.547 |
| 90.16460905349794 | 0.734 | 2.465 | 0.29 | 2.646 |
| 90.32921810699588 | 0.734 | 2.583 | 0.281 | 2.746 |
| 90.50411522633745 | 0.734 | 2.701 | 0.263 | 2.864 |
| 90.66872427983539 | 0.725 | 2.837 | 0.245 | 2.991 |
| 90.83333333333334 | 0.707 | 3 | 0.218 | 3.136 |
| 90.99794238683127 | 0.698 | 3.154 | 0.19 | 3.281 |
| 91.16255144032922 | 0.689 | 3.299 | 0.163 | 3.417 |
| 91.33744855967079 | 0.689 | 3.444 | 0.136 | 3.562 |
| 91.50205761316873 | 0.689 | 3.589 | 0.109 | 3.698 |
| 91.66666666666666 | 0.689 | 3.734 | 0.082 | 3.834 |
| 91.8312757201646 | 0.698 | 3.879 | 0.045 | 3.979 |
| 91.99588477366255 | 0.707 | 4.015 | 0.018 | 4.106 |
| 92.17078189300412 | 0.716 | 4.124 | -0.018 | 4.214 |
| 92.33539094650206 | 0.734 | 4.242 | -0.045 | 4.332 |
| 92.5 | 0.752 | 4.359 | -0.082 | 4.45 |
| 92.66460905349794 | 0.77 | 4.468 | -0.109 | 4.559 |
| 92.8292181069959 | 0.779 | 4.568 | -0.145 | 4.667 |
| 93.00411522633746 | 0.807 | 4.649 | -0.181 | 4.758 |
| 93.1687242798354 | 0.816 | 4.722 | -0.227 | 4.831 |
| 93.33333333333333 | 0.843 | 4.767 | -0.272 | 4.885 |
| 93.49794238683128 | 0.861 | 4.794 | -0.326 | 4.921 |
| 93.66255144032921 | 0.888 | 4.785 | -0.372 | 4.921 |
| 93.83744855967079 | 0.924 | 4.758 | -0.426 | 4.903 |
| 94.00205761316872 | 0.952 | 4.704 | -0.48 | 4.876 |
| 94.16666666666667 | 0.97 | 4.64 | -0.535 | 4.822 |
| 94.33127572016461 | 0.961 | 4.577 | -0.598 | 4.776 |
| 94.49588477366255 | 0.979 | 4.541 | -0.662 | 4.767 |
| 94.67078189300412 | 1.015 | 4.495 | -0.725 | 4.749 |
| 94.83539094650206 | 1.051 | 4.414 | -0.788 | 4.686 |
| 95.0 | 1.115 | 4.323 | -0.852 | 4.631 |
| 95.16460905349794 | 1.16 | 4.178 | -0.915 | 4.522 |
| 95.32921810699588 | 1.205 | 4.024 | -0.979 | 4.396 |
| 95.50411522633745 | 1.242 | 3.852 | -1.033 | 4.269 |
| 95.66872427983539 | 1.269 | 3.652 | -1.097 | 4.115 |
| 95.83333333333334 | 1.26 | 3.544 | -1.16 | 4.033 |
| 95.99794238683128 | 1.251 | 3.399 | -1.214 | 3.915 |
| 96.16255144032922 | 1.242 | 3.281 | -1.26 | 3.816 |
| 96.33744855967079 | 1.233 | 3.19 | -1.305 | 3.743 |
| 96.50205761316873 | 1.224 | 3.145 | -1.341 | 3.716 |
| 96.66666666666666 | 1.205 | 3.118 | -1.35 | 3.689 |
| 96.83127572016461 | 1.178 | 3.081 | -1.359 | 3.661 |
| 96.99588477366255 | 1.151 | 3.054 | -1.359 | 3.634 |
| 97.17078189300412 | 1.142 | 3.045 | -1.359 | 3.616 |
| 97.33539094650206 | 1.16 | 3.054 | -1.35 | 3.625 |
| 97.5 | 1.187 | 3.072 | -1.341 | 3.652 |
| 97.66460905349795 | 1.233 | 3.054 | -1.341 | 3.652 |
| 97.8292181069959 | 1.278 | 3.081 | -1.35 | 3.689 |
| 98.00411522633746 | 1.323 | 3.154 | -1.341 | 3.752 |
| 98.1687242798354 | 1.396 | 3.19 | -1.332 | 3.806 |
| 98.33333333333333 | 1.477 | 3.245 | -1.305 | 3.87 |
| 98.49794238683128 | 1.568 | 3.299 | -1.278 | 3.942 |
| 98.66255144032921 | 1.649 | 3.344 | -1.26 | 4.006 |
| 98.83744855967078 | 1.767 | 3.399 | -1.224 | 4.087 |
| 99.00205761316873 | 1.876 | 3.444 | -1.178 | 4.16 |
| 99.16666666666667 | 1.976 | 3.498 | -1.142 | 4.251 |
| 99.33127572016461 | 2.075 | 3.544 | -1.106 | 4.332 |
| 99.49588477366255 | 2.175 | 3.598 | -1.06 | 4.423 |
| 99.67078189300412 | 2.293 | 3.661 | -1.015 | 4.532 |
| 99.83539094650207 | 2.402 | 3.725 | -0.97 | 4.631 |
| 100.0 | 2.52 | 3.77 | -0.924 | 4.731 |